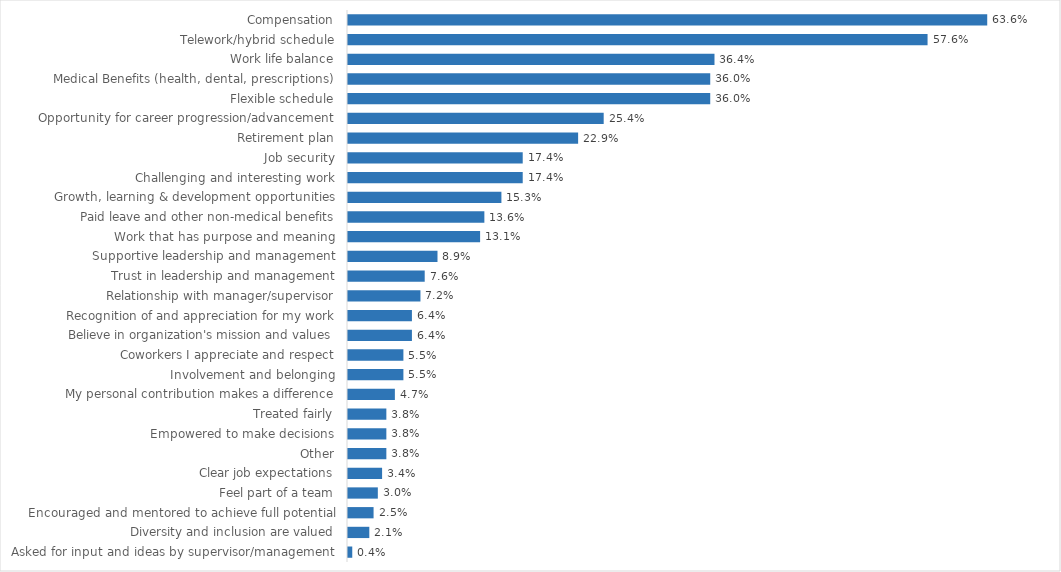
| Category | Vermont Health Access |
|---|---|
| Compensation | 0.636 |
| Telework/hybrid schedule | 0.576 |
| Work life balance | 0.364 |
| Medical Benefits (health, dental, prescriptions) | 0.36 |
| Flexible schedule | 0.36 |
| Opportunity for career progression/advancement | 0.254 |
| Retirement plan | 0.229 |
| Job security | 0.174 |
| Challenging and interesting work | 0.174 |
| Growth, learning & development opportunities | 0.153 |
| Paid leave and other non-medical benefits | 0.136 |
| Work that has purpose and meaning | 0.131 |
| Supportive leadership and management | 0.089 |
| Trust in leadership and management | 0.076 |
| Relationship with manager/supervisor | 0.072 |
| Recognition of and appreciation for my work | 0.064 |
| Believe in organization's mission and values | 0.064 |
| Coworkers I appreciate and respect | 0.055 |
| Involvement and belonging | 0.055 |
| My personal contribution makes a difference | 0.047 |
| Treated fairly | 0.038 |
| Empowered to make decisions | 0.038 |
| Other | 0.038 |
| Clear job expectations | 0.034 |
| Feel part of a team | 0.03 |
| Encouraged and mentored to achieve full potential | 0.025 |
| Diversity and inclusion are valued | 0.021 |
| Asked for input and ideas by supervisor/management | 0.004 |